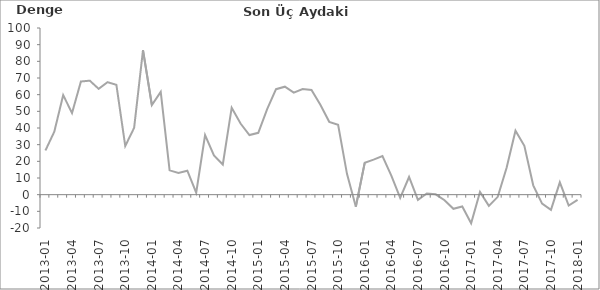
| Category | Denge  |
|---|---|
| 2013-01 | 26.5 |
|  | 37.8 |
|  | 59.7 |
| 2013-04 | 49 |
|  | 67.9 |
|  | 68.4 |
| 2013-07 | 63.5 |
|  | 67.5 |
|  | 65.9 |
| 2013-10 | 29.2 |
|  | 40.1 |
|  | 86.7 |
| 2014-01 | 53.8 |
|  | 61.7 |
|  | 14.6 |
| 2014-04 | 13 |
|  | 14.4 |
|  | 1.2 |
| 2014-07 | 35.7 |
|  | 23.6 |
|  | 18.1 |
| 2014-10 | 52.2 |
|  | 42.7 |
|  | 35.8 |
| 2015-01 | 37.1 |
|  | 51.3 |
|  | 63.3 |
| 2015-04 | 64.8 |
|  | 61.2 |
|  | 63.4 |
| 2015-07 | 62.8 |
|  | 53.9 |
|  | 43.7 |
| 2015-10 | 41.9 |
|  | 12.5 |
|  | -7.2 |
| 2016-01 | 19.1 |
|  | 21 |
|  | 23.2 |
| 2016-04 | 11.4 |
|  | -1.9 |
|  | 10.6 |
| 2016-07 | -3.1 |
|  | 0.7 |
|  | 0.2 |
| 2016-10 | -3.3 |
|  | -8.5 |
|  | -7.1 |
| 2017-01 | -17.2 |
|  | 1.6 |
|  | -6.7 |
| 2017-04 | -1.3 |
|  | 16.1 |
|  | 38.4 |
| 2017-07 | 29.3 |
|  | 5.6 |
|  | -5.4 |
| 2017-10 | -9.1 |
|  | 7.4 |
|  | -6.5 |
| 2018-01 | -3.1 |